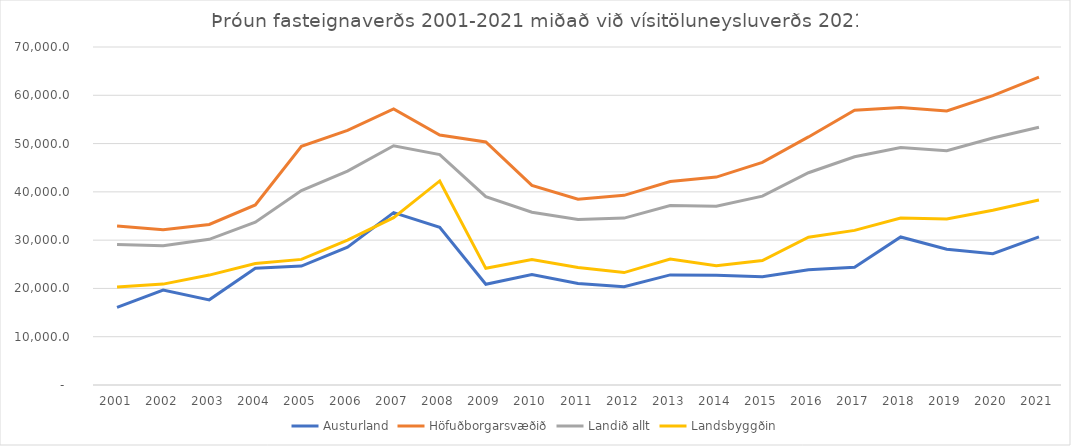
| Category | Austurland | Höfuðborgarsvæðið | Landið allt | Landsbyggðin |
|---|---|---|---|---|
| 2001.0 | 16084.118 | 32926.382 | 29091.528 | 20306.832 |
| 2002.0 | 19679.038 | 32151.85 | 28856.476 | 20892.935 |
| 2003.0 | 17634.363 | 33239.192 | 30169.454 | 22761.222 |
| 2004.0 | 24199.095 | 37276.955 | 33706.85 | 25160.389 |
| 2005.0 | 24627.011 | 49421.352 | 40261.399 | 26016.532 |
| 2006.0 | 28561.71 | 52720.481 | 44294.784 | 29996.224 |
| 2007.0 | 35702.827 | 57194.669 | 49542.299 | 34660.637 |
| 2008.0 | 32643.246 | 51781.34 | 47721.985 | 42258.855 |
| 2009.0 | 20852.587 | 50347.245 | 39026.426 | 24158.895 |
| 2010.0 | 22878.261 | 41324.799 | 35776.724 | 25981.974 |
| 2011.0 | 21005.231 | 38466.13 | 34275.677 | 24323.88 |
| 2012.0 | 20358.806 | 39279.947 | 34561.046 | 23278.165 |
| 2013.0 | 22798.734 | 42138.877 | 37163.721 | 26075.042 |
| 2014.0 | 22726.18 | 43061.772 | 37011.416 | 24688.136 |
| 2015.0 | 22421.429 | 46111.187 | 39119.246 | 25778.709 |
| 2016.0 | 23873.588 | 51373.724 | 43965.335 | 30616.632 |
| 2017.0 | 24376.03 | 56919.589 | 47257.895 | 32024.782 |
| 2018.0 | 30662.448 | 57469.87 | 49175.426 | 34594.356 |
| 2019.0 | 28101.324 | 56751.84 | 48527.111 | 34384.882 |
| 2020.0 | 27192.018 | 59924.838 | 51163.828 | 36208.453 |
| 2021.0 | 30661.85 | 63756.425 | 53392.526 | 38320.429 |